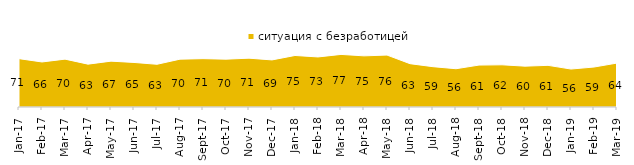
| Category | ситуация с безработицей |
|---|---|
| 2017-01-01 | 70.75 |
| 2017-02-01 | 65.9 |
| 2017-03-01 | 70.05 |
| 2017-04-01 | 62.7 |
| 2017-05-01 | 67.1 |
| 2017-06-01 | 65.2 |
| 2017-07-01 | 62.5 |
| 2017-08-01 | 70 |
| 2017-09-01 | 70.75 |
| 2017-10-01 | 70 |
| 2017-11-01 | 71.45 |
| 2017-12-01 | 68.9 |
| 2018-01-01 | 75.4 |
| 2018-02-01 | 73.25 |
| 2018-03-01 | 76.95 |
| 2018-04-01 | 74.85 |
| 2018-05-01 | 76 |
| 2018-06-01 | 63.4 |
| 2018-07-01 | 59 |
| 2018-08-01 | 56 |
| 2018-09-01 | 61.35 |
| 2018-10-01 | 61.75 |
| 2018-11-01 | 59.78 |
| 2018-12-01 | 60.95 |
| 2019-01-01 | 55.55 |
| 2019-02-01 | 58.5 |
| 2019-03-01 | 64.296 |